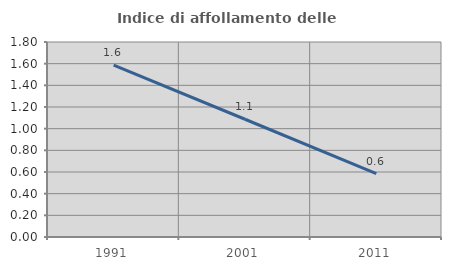
| Category | Indice di affollamento delle abitazioni  |
|---|---|
| 1991.0 | 1.587 |
| 2001.0 | 1.087 |
| 2011.0 | 0.585 |